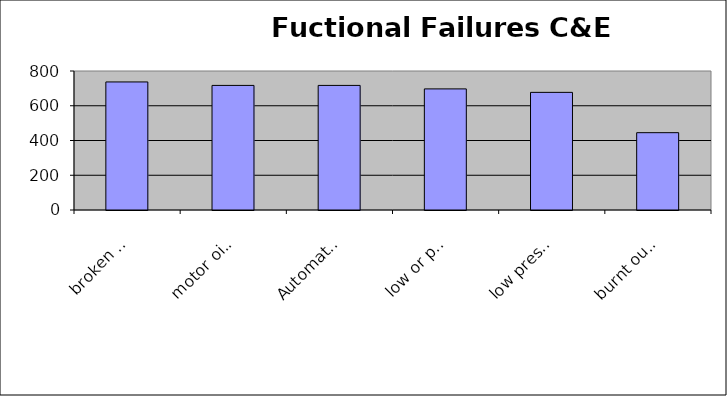
| Category | Failure Mode |
|---|---|
| broken Door Handle | 737 |
| motor oil fails | 717 |
| Automatic transmission oil fails | 717 |
| low or poor Motor Oil | 697 |
| low pressure on Spare tire | 677 |
| burnt out Head lights | 445 |